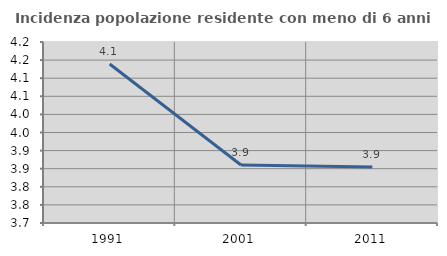
| Category | Incidenza popolazione residente con meno di 6 anni |
|---|---|
| 1991.0 | 4.139 |
| 2001.0 | 3.86 |
| 2011.0 | 3.854 |